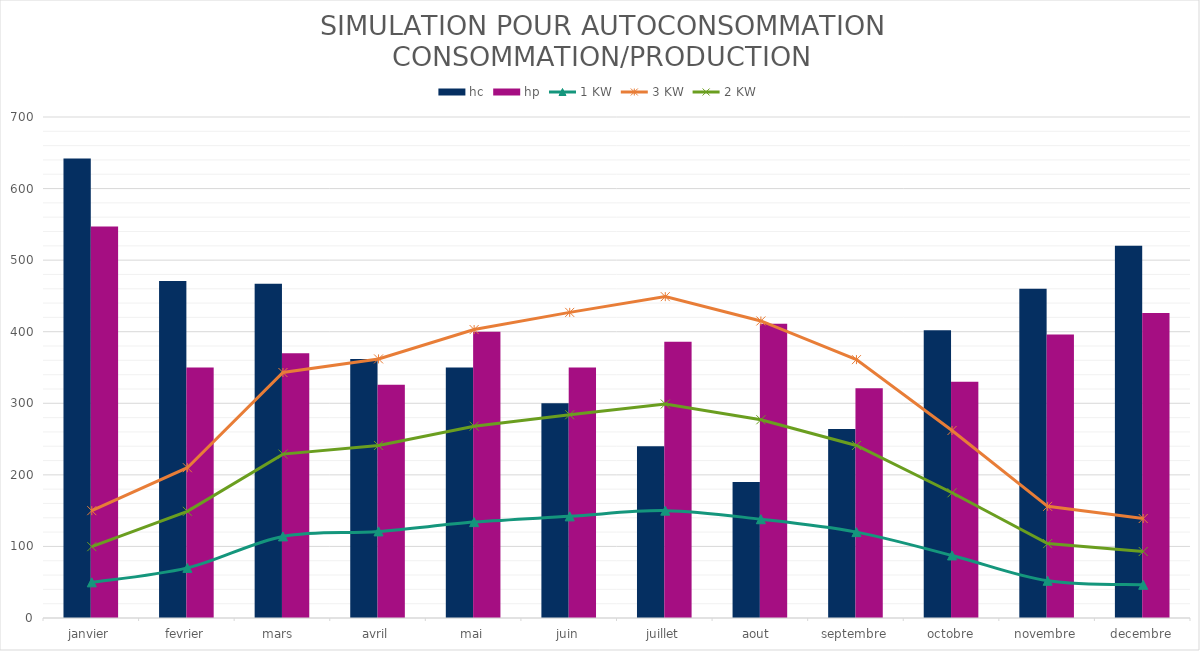
| Category | hc | hp |
|---|---|---|
| janvier | 642 | 547 |
| fevrier | 471 | 350 |
| mars  | 467 | 370 |
| avril | 362 | 326 |
| mai | 350 | 400 |
| juin | 300 | 350 |
| juillet | 240 | 386 |
| aout  | 190 | 411 |
| septembre | 264 | 321 |
| octobre | 402 | 330 |
| novembre | 460 | 396 |
| decembre | 520 | 426 |